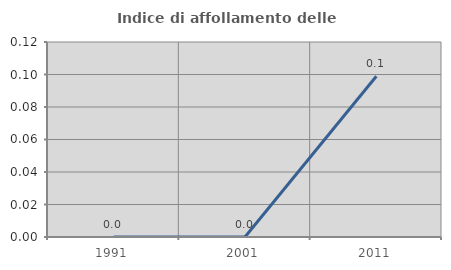
| Category | Indice di affollamento delle abitazioni  |
|---|---|
| 1991.0 | 0 |
| 2001.0 | 0 |
| 2011.0 | 0.099 |